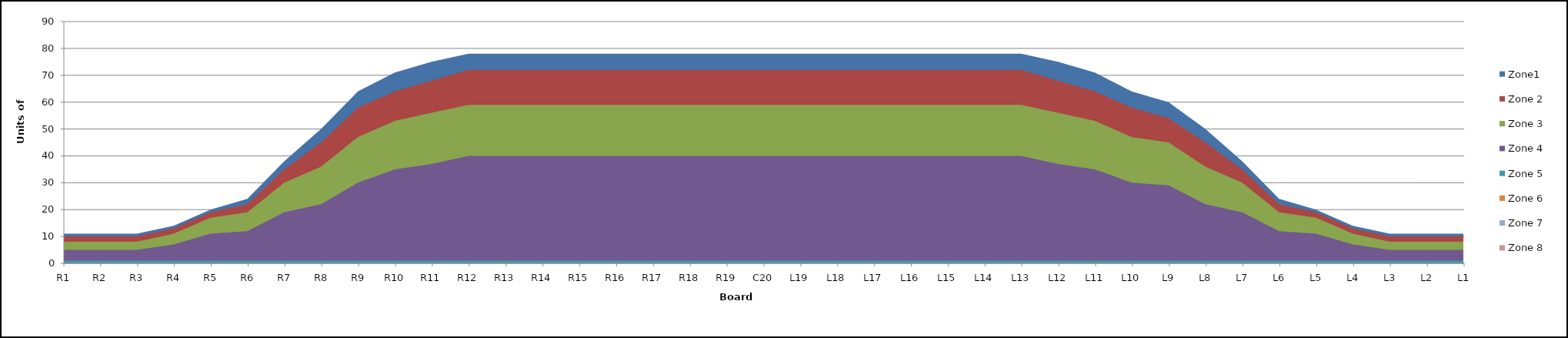
| Category | Zone1 | Zone 2 | Zone 3 | Zone 4 | Zone 5 | Zone 6 | Zone 7 | Zone 8 |
|---|---|---|---|---|---|---|---|---|
| L1 | 11 | 10 | 8 | 5 | 1 |  |  |  |
| L2 | 11 | 10 | 8 | 5 | 1 |  |  |  |
| L3 | 11 | 10 | 8 | 5 | 1 |  |  |  |
| L4 | 14 | 13 | 11 | 7 | 1 |  |  |  |
| L5 | 20 | 19 | 17 | 11 | 1 |  |  |  |
| L6 | 24 | 22 | 19 | 12 | 1 |  |  |  |
| L7 | 38 | 35 | 30 | 19 | 1 |  |  |  |
| L8 | 50 | 45 | 36 | 22 | 1 |  |  |  |
| L9 | 60 | 54 | 45 | 29 | 1 |  |  |  |
| L10 | 64 | 58 | 47 | 30 | 1 |  |  |  |
| L11 | 71 | 64 | 53 | 35 | 1 |  |  |  |
| L12 | 75 | 68 | 56 | 37 | 1 |  |  |  |
| L13 | 78 | 72 | 59 | 40 | 1 |  |  |  |
| L14 | 78 | 72 | 59 | 40 | 1 |  |  |  |
| L15 | 78 | 72 | 59 | 40 | 1 |  |  |  |
| L16 | 78 | 72 | 59 | 40 | 1 |  |  |  |
| L17 | 78 | 72 | 59 | 40 | 1 |  |  |  |
| L18 | 78 | 72 | 59 | 40 | 1 |  |  |  |
| L19 | 78 | 72 | 59 | 40 | 1 |  |  |  |
| C20 | 78 | 72 | 59 | 40 | 1 |  |  |  |
| R19 | 78 | 72 | 59 | 40 | 1 |  |  |  |
| R18 | 78 | 72 | 59 | 40 | 1 |  |  |  |
| R17 | 78 | 72 | 59 | 40 | 1 |  |  |  |
| R16 | 78 | 72 | 59 | 40 | 1 |  |  |  |
| R15 | 78 | 72 | 59 | 40 | 1 |  |  |  |
| R14 | 78 | 72 | 59 | 40 | 1 |  |  |  |
| R13 | 78 | 72 | 59 | 40 | 1 |  |  |  |
| R12 | 78 | 72 | 59 | 40 | 1 |  |  |  |
| R11 | 75 | 68 | 56 | 37 | 1 |  |  |  |
| R10 | 71 | 64 | 53 | 35 | 1 |  |  |  |
| R9 | 64 | 58 | 47 | 30 | 1 |  |  |  |
| R8 | 50 | 45 | 36 | 22 | 1 |  |  |  |
| R7 | 38 | 35 | 30 | 19 | 1 |  |  |  |
| R6 | 24 | 22 | 19 | 12 | 1 |  |  |  |
| R5 | 20 | 19 | 17 | 11 | 1 |  |  |  |
| R4 | 14 | 13 | 11 | 7 | 1 |  |  |  |
| R3 | 11 | 10 | 8 | 5 | 1 |  |  |  |
| R2 | 11 | 10 | 8 | 5 | 1 |  |  |  |
| R1 | 11 | 10 | 8 | 5 | 1 |  |  |  |